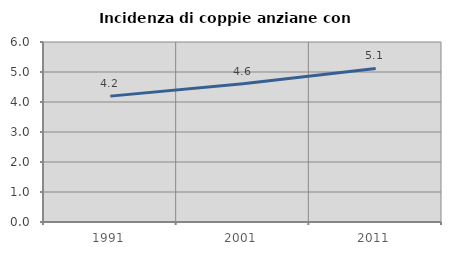
| Category | Incidenza di coppie anziane con figli |
|---|---|
| 1991.0 | 4.196 |
| 2001.0 | 4.61 |
| 2011.0 | 5.119 |